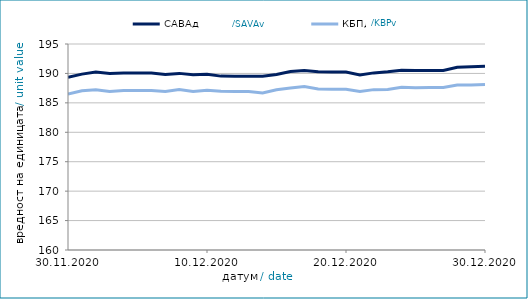
| Category | САВАд | КБПд |
|---|---|---|
| 2020-11-30 | 189.328 | 186.501 |
| 2020-12-01 | 189.883 | 187.057 |
| 2020-12-02 | 190.233 | 187.237 |
| 2020-12-03 | 189.978 | 186.941 |
| 2020-12-04 | 190.071 | 187.112 |
| 2020-12-05 | 190.054 | 187.085 |
| 2020-12-06 | 190.059 | 187.092 |
| 2020-12-07 | 189.815 | 186.931 |
| 2020-12-08 | 190.008 | 187.252 |
| 2020-12-09 | 189.764 | 186.94 |
| 2020-12-10 | 189.842 | 187.143 |
| 2020-12-11 | 189.543 | 186.959 |
| 2020-12-12 | 189.506 | 186.914 |
| 2020-12-13 | 189.511 | 186.921 |
| 2020-12-14 | 189.521 | 186.682 |
| 2020-12-15 | 189.823 | 187.236 |
| 2020-12-16 | 190.314 | 187.52 |
| 2020-12-17 | 190.509 | 187.782 |
| 2020-12-18 | 190.285 | 187.34 |
| 2020-12-19 | 190.247 | 187.292 |
| 2020-12-20 | 190.252 | 187.299 |
| 2020-12-21 | 189.75 | 186.926 |
| 2020-12-22 | 190.093 | 187.247 |
| 2020-12-23 | 190.284 | 187.269 |
| 2020-12-24 | 190.549 | 187.651 |
| 2020-12-25 | 190.492 | 187.584 |
| 2020-12-26 | 190.494 | 187.59 |
| 2020-12-27 | 190.498 | 187.597 |
| 2020-12-28 | 191.041 | 188.043 |
| 2020-12-29 | 191.134 | 188.054 |
| 2020-12-30 | 191.237 | 188.129 |